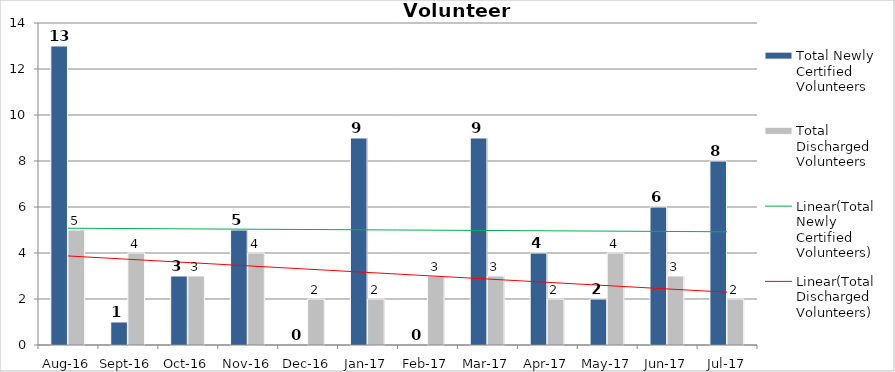
| Category | Total Newly Certified Volunteers | Total Discharged Volunteers |
|---|---|---|
| Aug-16 | 13 | 5 |
| Sep-16 | 1 | 4 |
| Oct-16 | 3 | 3 |
| Nov-16 | 5 | 4 |
| Dec-16 | 0 | 2 |
| Jan-17 | 9 | 2 |
| Feb-17 | 0 | 3 |
| Mar-17 | 9 | 3 |
| Apr-17 | 4 | 2 |
| May-17 | 2 | 4 |
| Jun-17 | 6 | 3 |
| Jul-17 | 8 | 2 |